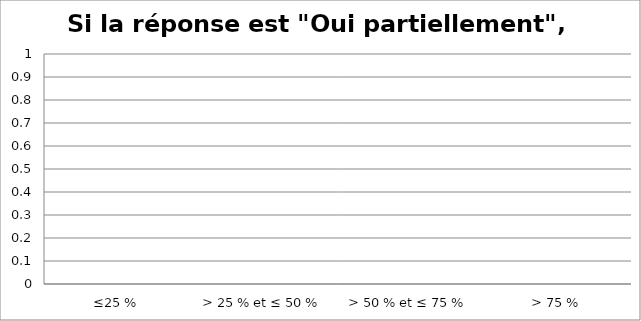
| Category | Si la réponse est "Oui partiellement", estimez le %  |
|---|---|
| ≤25 % | 0 |
| > 25 % et ≤ 50 % | 0 |
| > 50 % et ≤ 75 % | 0 |
| > 75 % | 0 |